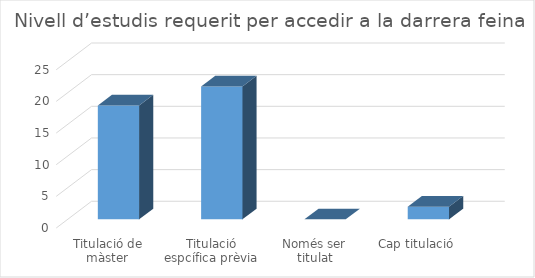
| Category | Series 0 |
|---|---|
| Titulació de màster | 18 |
| Titulació espcífica prèvia | 21 |
| Només ser titulat universitari | 0 |
| Cap titulació | 2 |